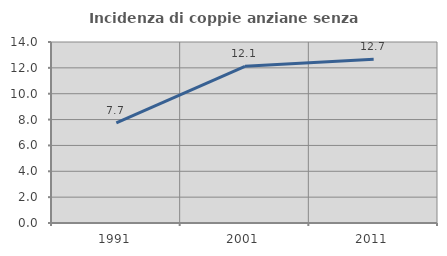
| Category | Incidenza di coppie anziane senza figli  |
|---|---|
| 1991.0 | 7.742 |
| 2001.0 | 12.121 |
| 2011.0 | 12.661 |